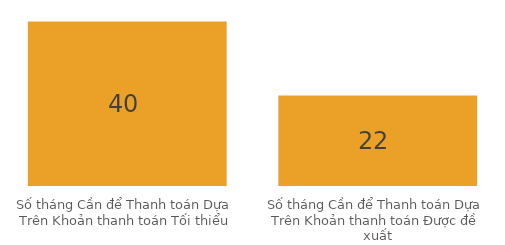
| Category | Series 0 |
|---|---|
| Số tháng Cần để Thanh toán Dựa Trên Khoản thanh toán Tối thiểu | 40 |
| Số tháng Cần để Thanh toán Dựa Trên Khoản thanh toán Được đề xuất | 22 |